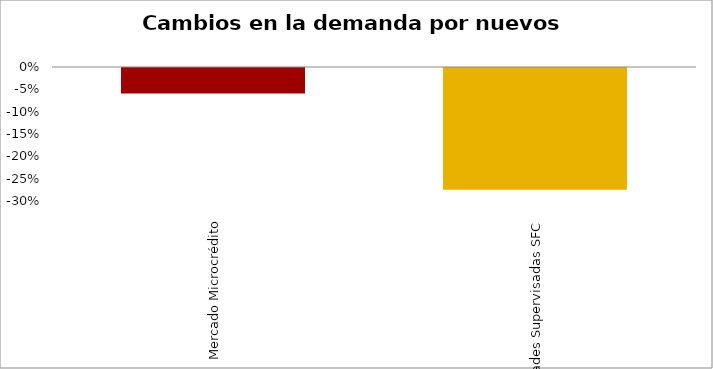
| Category | Microcrédito |
|---|---|
| Mercado Microcrédito | -0.057 |
| Entidades Supervisadas SFC | -0.273 |